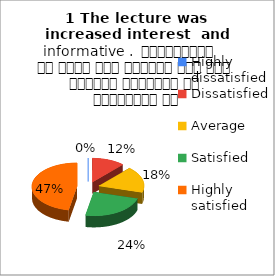
| Category | 1 The lecture was  increased interest  and informative .  व्याख्यान से रुचि में वृद्धि हुई एवं शिक्षण जानकारी से परिपूर्ण था |
|---|---|
| Highly dissatisfied | 0 |
| Dissatisfied | 2 |
| Average | 3 |
| Satisfied | 4 |
| Highly satisfied | 8 |